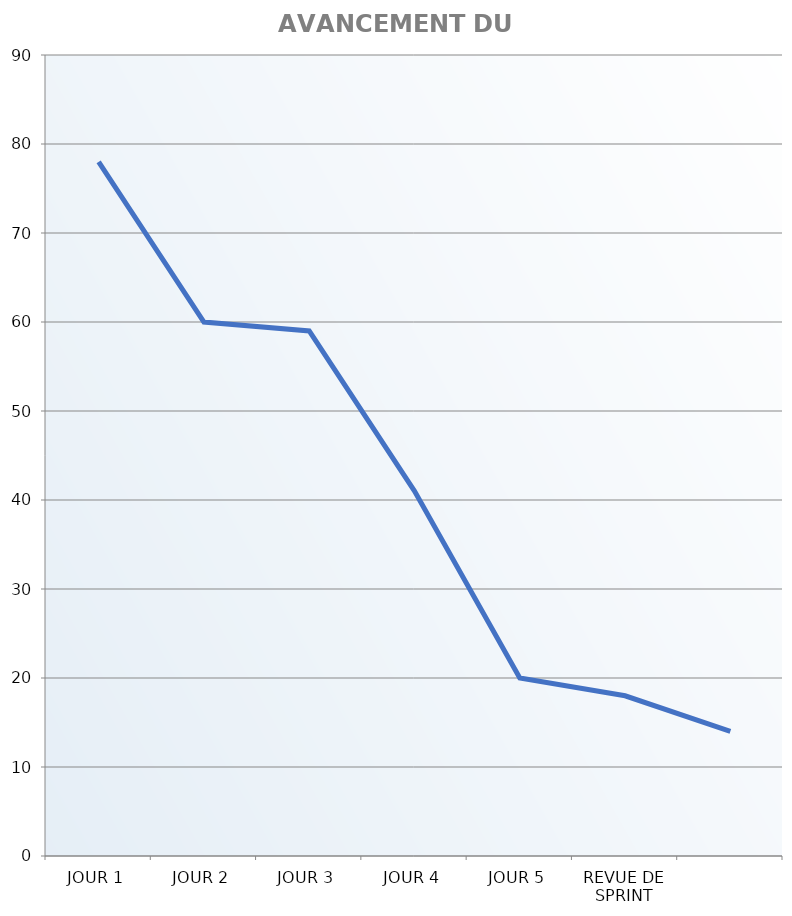
| Category | DIAGRAMME D’AVANCEMENT DU SPRINT |
|---|---|
| JOUR 1 | 78 |
| JOUR 2 | 60 |
| JOUR 3 | 59 |
| JOUR 4 | 41 |
| JOUR 5 | 20 |
| REVUE DE SPRINT | 18 |